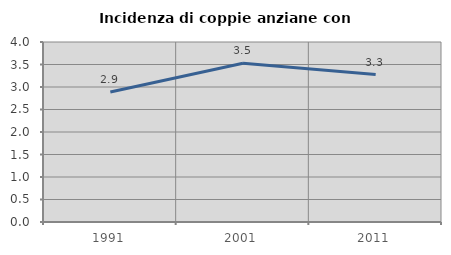
| Category | Incidenza di coppie anziane con figli |
|---|---|
| 1991.0 | 2.889 |
| 2001.0 | 3.527 |
| 2011.0 | 3.276 |